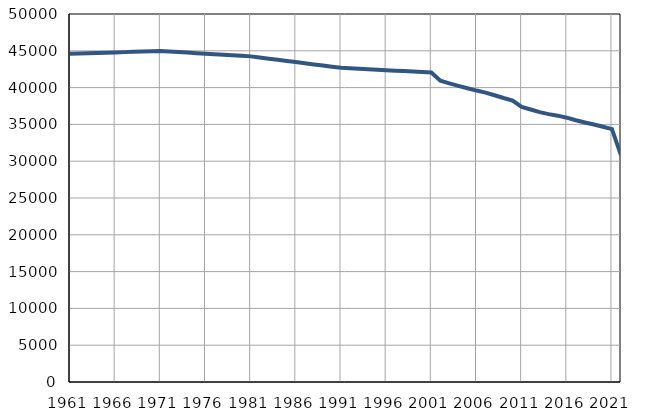
| Category | Population
size |
|---|---|
| 1961.0 | 44585 |
| 1962.0 | 44623 |
| 1963.0 | 44663 |
| 1964.0 | 44702 |
| 1965.0 | 44741 |
| 1966.0 | 44781 |
| 1967.0 | 44820 |
| 1968.0 | 44859 |
| 1969.0 | 44898 |
| 1970.0 | 44937 |
| 1971.0 | 44976 |
| 1972.0 | 44903 |
| 1973.0 | 44829 |
| 1974.0 | 44756 |
| 1975.0 | 44683 |
| 1976.0 | 44610 |
| 1977.0 | 44536 |
| 1978.0 | 44463 |
| 1979.0 | 44390 |
| 1980.0 | 44316 |
| 1981.0 | 44243 |
| 1982.0 | 44087 |
| 1983.0 | 43931 |
| 1984.0 | 43776 |
| 1985.0 | 43620 |
| 1986.0 | 43464 |
| 1987.0 | 43309 |
| 1988.0 | 43152 |
| 1989.0 | 42997 |
| 1990.0 | 42841 |
| 1991.0 | 42685 |
| 1992.0 | 42621 |
| 1993.0 | 42558 |
| 1994.0 | 42494 |
| 1995.0 | 42431 |
| 1996.0 | 42367 |
| 1997.0 | 42304 |
| 1998.0 | 42240 |
| 1999.0 | 42177 |
| 2000.0 | 42113 |
| 2001.0 | 42050 |
| 2002.0 | 40928 |
| 2003.0 | 40580 |
| 2004.0 | 40238 |
| 2005.0 | 39912 |
| 2006.0 | 39597 |
| 2007.0 | 39317 |
| 2008.0 | 38965 |
| 2009.0 | 38587 |
| 2010.0 | 38248 |
| 2011.0 | 37385 |
| 2012.0 | 37020 |
| 2013.0 | 36663 |
| 2014.0 | 36399 |
| 2015.0 | 36187 |
| 2016.0 | 35911 |
| 2017.0 | 35567 |
| 2018.0 | 35266 |
| 2019.0 | 34983 |
| 2020.0 | 34675 |
| 2021.0 | 34350 |
| 2022.0 | 30784 |